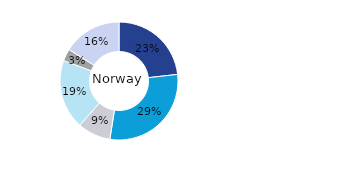
| Category | Norway |
|---|---|
| Office | 0.232 |
| Residential | 0.293 |
| Retail | 0.091 |
| Logistics* | 0.191 |
| Public Sector** | 0.033 |
| Other | 0.161 |